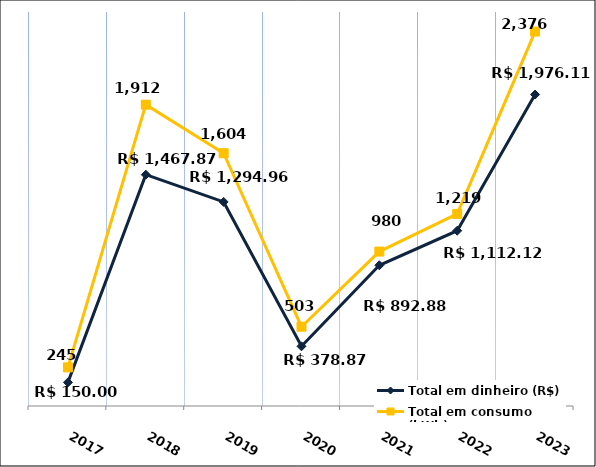
| Category | Total em dinheiro (R$) |
|---|---|
| 2017.0 | 150 |
| 2018.0 | 1467.87 |
| 2019.0 | 1294.96 |
| 2020.0 | 378.87 |
| 2021.0 | 892.88 |
| 2022.0 | 1112.12 |
| 2023.0 | 1976.11 |